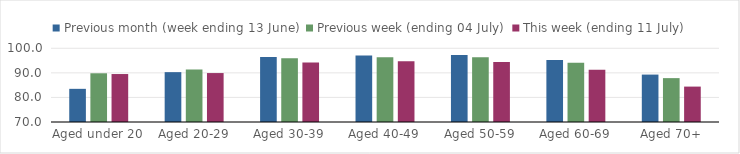
| Category | Previous month (week ending 13 June) | Previous week (ending 04 July) | This week (ending 11 July) |
|---|---|---|---|
| Aged under 20 | 83.496 | 89.829 | 89.522 |
| Aged 20-29 | 90.292 | 91.321 | 89.918 |
| Aged 30-39 | 96.427 | 95.94 | 94.259 |
| Aged 40-49 | 97.086 | 96.304 | 94.673 |
| Aged 50-59 | 97.31 | 96.374 | 94.447 |
| Aged 60-69 | 95.198 | 94.102 | 91.3 |
| Aged 70+ | 89.297 | 87.857 | 84.41 |